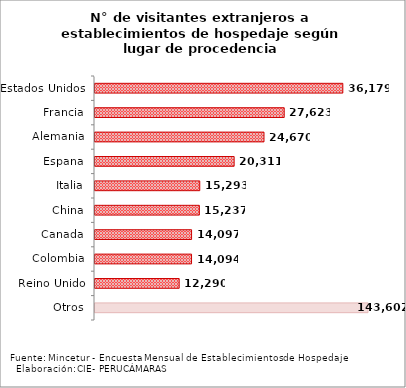
| Category | Series 0 |
|---|---|
| Estados Unidos | 36179 |
| Francia | 27623 |
| Alemania | 24670 |
| Espana | 20311 |
| Italia | 15293 |
| China | 15237 |
| Canada | 14097 |
| Colombia | 14094 |
| Reino Unido | 12290 |
| Otros | 143602 |